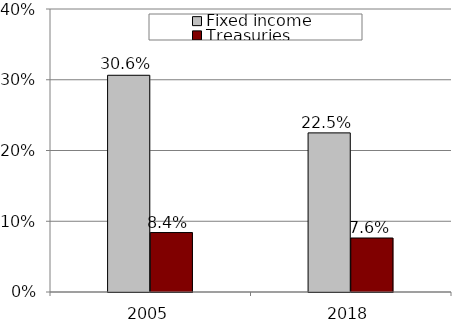
| Category | Fixed income | Treasuries |
|---|---|---|
| 2005.0 | 0.306 | 0.084 |
| 2018.0 | 0.225 | 0.076 |